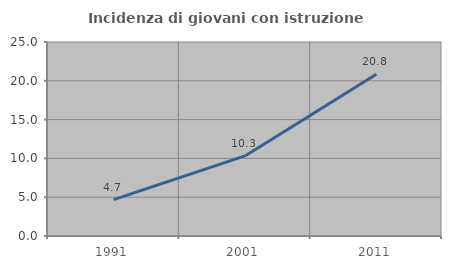
| Category | Incidenza di giovani con istruzione universitaria |
|---|---|
| 1991.0 | 4.688 |
| 2001.0 | 10.317 |
| 2011.0 | 20.849 |